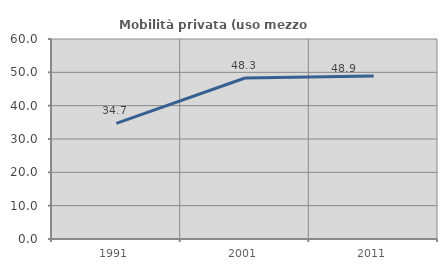
| Category | Mobilità privata (uso mezzo privato) |
|---|---|
| 1991.0 | 34.694 |
| 2001.0 | 48.308 |
| 2011.0 | 48.928 |